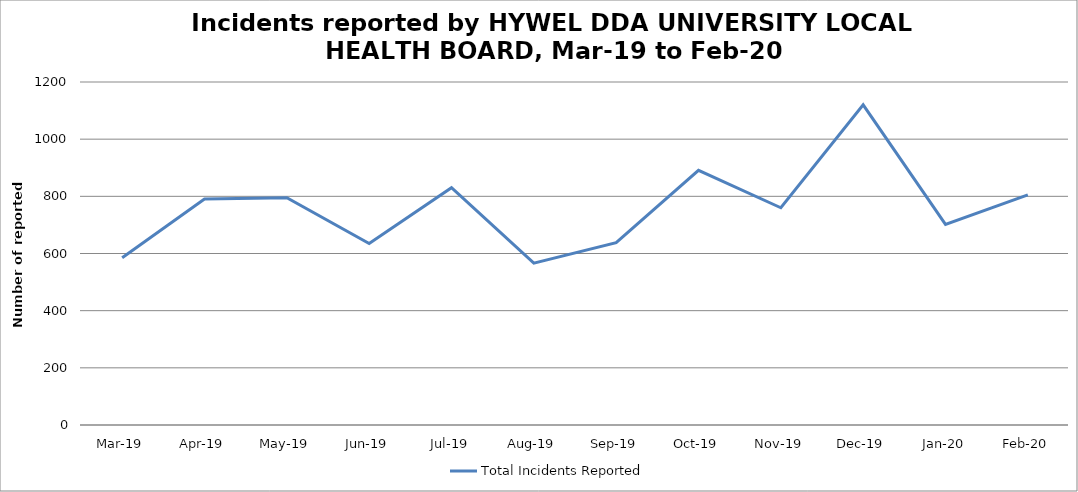
| Category | Total Incidents Reported |
|---|---|
| Mar-19 | 585 |
| Apr-19 | 791 |
| May-19 | 795 |
| Jun-19 | 635 |
| Jul-19 | 830 |
| Aug-19 | 566 |
| Sep-19 | 638 |
| Oct-19 | 891 |
| Nov-19 | 760 |
| Dec-19 | 1120 |
| Jan-20 | 702 |
| Feb-20 | 805 |